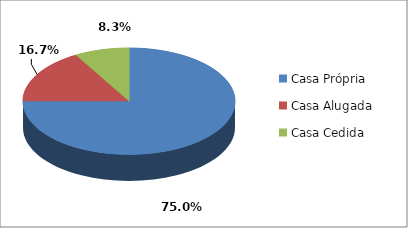
| Category | Series 0 |
|---|---|
| Casa Própria | 27 |
| Casa Alugada | 6 |
| Casa Cedida | 3 |